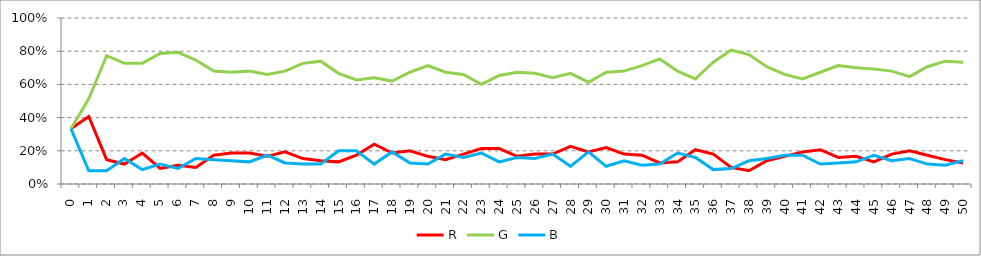
| Category | R | G | B |
|---|---|---|---|
| 0.0 | 0.333 | 0.333 | 0.333 |
| 1.0 | 0.407 | 0.513 | 0.08 |
| 2.0 | 0.147 | 0.773 | 0.08 |
| 3.0 | 0.12 | 0.727 | 0.153 |
| 4.0 | 0.187 | 0.727 | 0.087 |
| 5.0 | 0.093 | 0.787 | 0.12 |
| 6.0 | 0.113 | 0.793 | 0.093 |
| 7.0 | 0.1 | 0.747 | 0.153 |
| 8.0 | 0.173 | 0.68 | 0.147 |
| 9.0 | 0.187 | 0.673 | 0.14 |
| 10.0 | 0.187 | 0.68 | 0.133 |
| 11.0 | 0.167 | 0.66 | 0.173 |
| 12.0 | 0.193 | 0.68 | 0.127 |
| 13.0 | 0.153 | 0.727 | 0.12 |
| 14.0 | 0.14 | 0.74 | 0.12 |
| 15.0 | 0.133 | 0.667 | 0.2 |
| 16.0 | 0.173 | 0.627 | 0.2 |
| 17.0 | 0.24 | 0.64 | 0.12 |
| 18.0 | 0.187 | 0.62 | 0.193 |
| 19.0 | 0.2 | 0.673 | 0.127 |
| 20.0 | 0.167 | 0.713 | 0.12 |
| 21.0 | 0.147 | 0.673 | 0.18 |
| 22.0 | 0.18 | 0.66 | 0.16 |
| 23.0 | 0.213 | 0.6 | 0.187 |
| 24.0 | 0.213 | 0.653 | 0.133 |
| 25.0 | 0.167 | 0.673 | 0.16 |
| 26.0 | 0.18 | 0.667 | 0.153 |
| 27.0 | 0.18 | 0.64 | 0.18 |
| 28.0 | 0.227 | 0.667 | 0.107 |
| 29.0 | 0.193 | 0.613 | 0.193 |
| 30.0 | 0.22 | 0.673 | 0.107 |
| 31.0 | 0.18 | 0.68 | 0.14 |
| 32.0 | 0.173 | 0.713 | 0.113 |
| 33.0 | 0.127 | 0.753 | 0.12 |
| 34.0 | 0.133 | 0.68 | 0.187 |
| 35.0 | 0.207 | 0.633 | 0.16 |
| 36.0 | 0.18 | 0.733 | 0.087 |
| 37.0 | 0.1 | 0.807 | 0.093 |
| 38.0 | 0.08 | 0.78 | 0.14 |
| 39.0 | 0.14 | 0.707 | 0.153 |
| 40.0 | 0.167 | 0.66 | 0.173 |
| 41.0 | 0.193 | 0.633 | 0.173 |
| 42.0 | 0.207 | 0.673 | 0.12 |
| 43.0 | 0.16 | 0.713 | 0.127 |
| 44.0 | 0.167 | 0.7 | 0.133 |
| 45.0 | 0.133 | 0.693 | 0.173 |
| 46.0 | 0.18 | 0.68 | 0.14 |
| 47.0 | 0.2 | 0.647 | 0.153 |
| 48.0 | 0.173 | 0.707 | 0.12 |
| 49.0 | 0.147 | 0.74 | 0.113 |
| 50.0 | 0.127 | 0.733 | 0.14 |